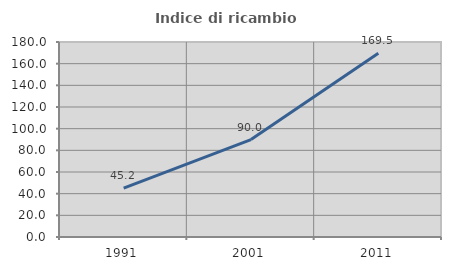
| Category | Indice di ricambio occupazionale  |
|---|---|
| 1991.0 | 45.161 |
| 2001.0 | 89.967 |
| 2011.0 | 169.545 |